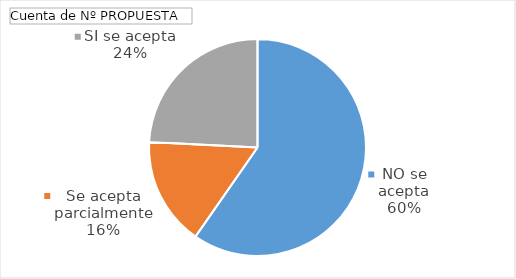
| Category | Total |
|---|---|
| NO se acepta | 37 |
| Se acepta parcialmente | 10 |
| SI se acepta | 15 |